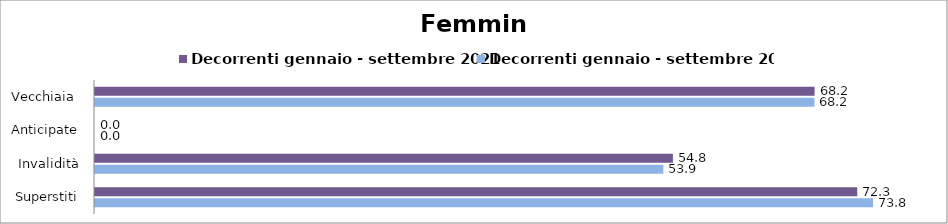
| Category | Decorrenti gennaio - settembre 2021 | Decorrenti gennaio - settembre 2022 |
|---|---|---|
| Vecchiaia  | 68.21 | 68.19 |
| Anticipate | 0 | 0 |
| Invalidità | 54.78 | 53.87 |
| Superstiti | 72.25 | 73.75 |